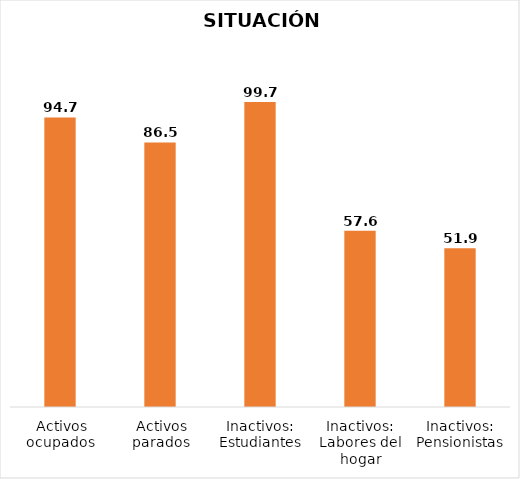
| Category | Series 0 |
|---|---|
|  Activos ocupados | 94.7 |
|  Activos parados | 86.5 |
| Inactivos: Estudiantes | 99.7 |
| Inactivos: Labores del hogar | 57.6 |
| Inactivos: Pensionistas | 51.9 |